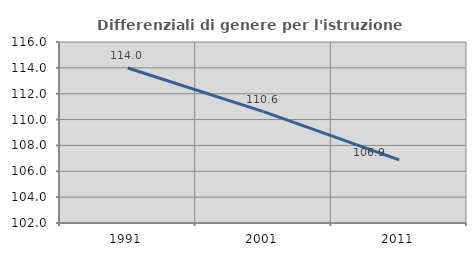
| Category | Differenziali di genere per l'istruzione superiore |
|---|---|
| 1991.0 | 113.989 |
| 2001.0 | 110.618 |
| 2011.0 | 106.883 |